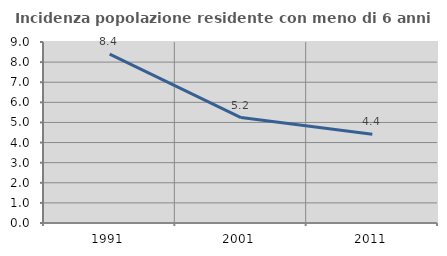
| Category | Incidenza popolazione residente con meno di 6 anni |
|---|---|
| 1991.0 | 8.395 |
| 2001.0 | 5.241 |
| 2011.0 | 4.411 |